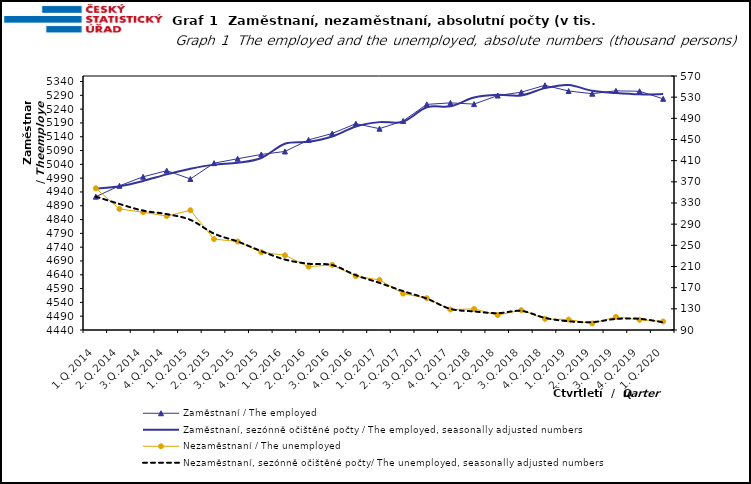
| Category | Zaměstnaní / The employed | Zaměstnaní, sezónně očištěné počty / The employed, seasonally adjusted numbers |
|---|---|---|
| 1.Q.2014 | 4922.963 | 4952.405 |
| 2.Q.2014 | 4962.219 | 4960.65 |
| 3.Q.2014 | 4994.947 | 4979.618 |
| 4.Q.2014 | 5017.051 | 5003.629 |
| 1.Q.2015 | 4987.141 | 5023.827 |
| 2.Q.2015 | 5044.285 | 5038.984 |
| 3.Q.2015 | 5060.3 | 5045.647 |
| 4.Q.2015 | 5075.884 | 5063.085 |
| 1.Q.2016 | 5086.671 | 5114.698 |
| 2.Q.2016 | 5128.493 | 5121.602 |
| 3.Q.2016 | 5151.712 | 5140.967 |
| 4.Q.2016 | 5187.436 | 5177.35 |
| 1.Q.2017 | 5169.203 | 5192.941 |
| 2.Q.2017 | 5197.265 | 5194.555 |
| 3.Q.2017 | 5257.26 | 5246.726 |
| 4.Q.2017 | 5262.691 | 5250.237 |
| 1.Q.2018 | 5258.225 | 5281.99 |
| 2.Q.2018 | 5289.242 | 5291.982 |
| 3.Q.2018 | 5301.361 | 5289.641 |
| 4.Q.2018 | 5326.327 | 5316.128 |
| 1.Q.2019 | 5305.534 | 5327.565 |
| 2.Q.2019 | 5295.929 | 5306.306 |
| 3.Q.2019 | 5306.247 | 5298.103 |
| 4.Q.2019 | 5304.7 | 5293.467 |
| 1.Q.2020 | 5277.418 | 5294.602 |